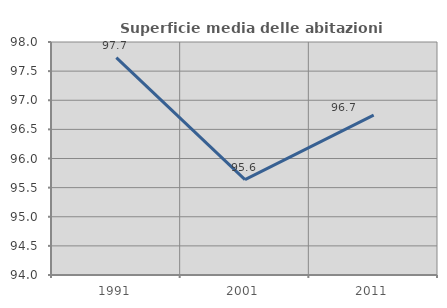
| Category | Superficie media delle abitazioni occupate |
|---|---|
| 1991.0 | 97.733 |
| 2001.0 | 95.637 |
| 2011.0 | 96.743 |